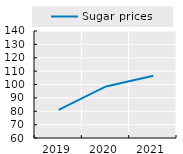
| Category | Sugar prices |
|---|---|
| 2019.0 | 81.022 |
| 2020.0 | 98.566 |
| 2021.0 | 106.539 |